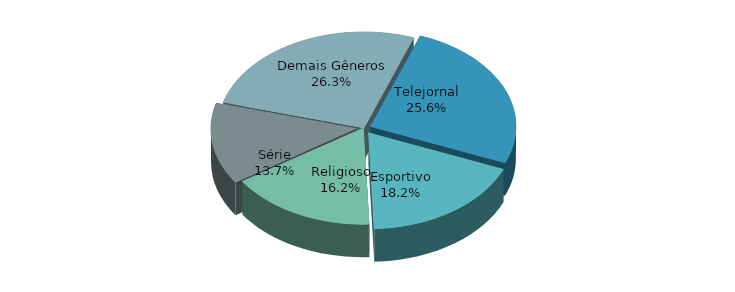
| Category | Series 0 | Series 1 |
|---|---|---|
| Telejornal | 135085 | 0.256 |
| Esportivo | 95917 | 0.182 |
| Religioso | 85604 | 0.162 |
| Série | 72028 | 0.137 |
| Demais Gêneros | 138406 | 0.263 |